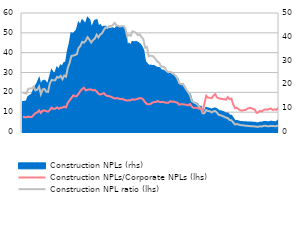
| Category | Construction NPL ratio (lhs) | Construction NPLs/Corporate NPLs (lhs) |
|---|---|---|
|  | 19.909 | 7.77 |
|  | 19.587 | 7.459 |
|  | 19.384 | 7.403 |
|  | 21.841 | 7.803 |
| 6
2010 | 21.9 | 7.569 |
|  | 21.893 | 7.585 |
|  | 22.897 | 8.602 |
|  | 20.957 | 9.578 |
|  | 21.316 | 9.883 |
|  | 22.951 | 10.902 |
| 12 | 19.044 | 9.605 |
| 1
2011 | 21.464 | 10.773 |
|  | 21.647 | 10.817 |
|  | 20.33 | 10.537 |
|  | 20.222 | 10.213 |
|  | 24.486 | 11.167 |
| 6
2011 | 26.307 | 12.286 |
|  | 26.025 | 11.63 |
|  | 26.069 | 11.734 |
|  | 27.804 | 12.439 |
|  | 27.388 | 11.715 |
|  | 28.322 | 12.235 |
| 12 | 26.666 | 12.303 |
| 1
2012 | 28.495 | 12.822 |
|  | 27.903 | 12.414 |
|  | 32.444 | 14.729 |
|  | 34.841 | 15.967 |
|  | 38.393 | 17.166 |
| 6
2012 | 38.504 | 18.425 |
|  | 38.824 | 18.02 |
|  | 39.218 | 18.083 |
|  | 42.401 | 19.329 |
|  | 43.421 | 20.716 |
|  | 45.464 | 21.691 |
| 12 | 45.077 | 22.315 |
| 1
2013 | 46.093 | 20.946 |
|  | 47.827 | 21.339 |
|  | 46.562 | 21.484 |
|  | 45.129 | 21.378 |
|  | 46.309 | 20.985 |
| 6
2013 | 47.078 | 21.124 |
|  | 49.061 | 20.535 |
|  | 47.719 | 19.305 |
|  | 49.11 | 18.858 |
|  | 49.753 | 19.235 |
|  | 51.351 | 19.613 |
| 12 | 52.672 | 18.623 |
| 1
2014 | 52.459 | 18.13 |
|  | 53.449 | 18.092 |
|  | 53.4 | 17.773 |
|  | 53.814 | 17.325 |
|  | 55.031 | 16.909 |
| 6
2014 | 53.856 | 17.062 |
|  | 53.532 | 17.007 |
|  | 53.153 | 16.589 |
|  | 53.392 | 16.713 |
|  | 53.438 | 16.409 |
|  | 52.2 | 16.064 |
| 12 | 48.26 | 15.867 |
| 1
2015 | 48.994 | 15.97 |
|  | 48.54 | 16.023 |
|  | 50.819 | 16.5 |
|  | 50.398 | 16.224 |
|  | 50.034 | 16.529 |
| 6
2015 | 48.852 | 16.755 |
|  | 49.2 | 17.08 |
|  | 47.851 | 17.074 |
|  | 46.8 | 16.302 |
|  | 42.497 | 15.02 |
|  | 42.897 | 14.115 |
| 12 | 38.217 | 14.005 |
| 1
2016 | 38.481 | 14.086 |
|  | 38.357 | 14.828 |
|  | 37.683 | 15.073 |
|  | 36.469 | 15.098 |
|  | 35.485 | 15.671 |
| 6
2016 | 34.686 | 15.189 |
|  | 32.812 | 15.006 |
|  | 33.031 | 15.257 |
|  | 32.472 | 14.824 |
|  | 30.854 | 14.772 |
|  | 30.237 | 14.756 |
| 12 | 30.25 | 15.536 |
| 1
2017 | 30.017 | 15.275 |
|  | 29.166 | 15.356 |
|  | 28.279 | 14.979 |
|  | 26.947 | 14.796 |
|  | 24.631 | 13.709 |
| 6
2017 | 24.106 | 14.046 |
|  | 24.082 | 14.052 |
|  | 22.783 | 13.837 |
|  | 21.226 | 13.72 |
|  | 19.97 | 13.447 |
|  | 18.452 | 14.114 |
| 12 | 15.625 | 12.822 |
| 1
2018 | 14.94 | 12.128 |
|  | 14.54 | 12.227 |
|  | 13.92 | 12.239 |
|  | 12.85 | 11.727 |
|  | 11.9 | 11.834 |
| 6
2018 | 9.5 | 10.392 |
|  | 9.47 | 14.361 |
|  | 11.06 | 18.232 |
|  | 10.59 | 17.345 |
|  | 10.44 | 17.269 |
|  | 9.88 | 17.028 |
| 12 | 10.41 | 18.313 |
| 1
2019 | 10.579 | 19.133 |
|  | 9.755 | 17.365 |
|  | 8.609 | 16.93 |
|  | 8.463 | 16.813 |
|  | 8.06 | 16.583 |
| 6
2019 | 7.693 | 16.56 |
|  | 7.264 | 16.26 |
|  | 7.001 | 17.614 |
|  | 6.068 | 16.511 |
|  | 5.909 | 16.838 |
|  | 4.879 | 13.922 |
| 12 | 3.783 | 12.044 |
| 1
2020 | 4.026 | 12.199 |
|  | 3.781 | 11.477 |
|  | 3.49 | 10.947 |
|  | 3.39 | 10.794 |
|  | 3.325 | 11.042 |
| 6
2020 | 3.14 | 11.152 |
|  | 3.091 | 11.832 |
|  | 3.018 | 12.084 |
|  | 2.917 | 12.046 |
|  | 2.859 | 11.635 |
|  | 2.814 | 11.33 |
| 12 | 2.679 | 9.661 |
| 1
2021 | 2.663 | 9.887 |
|  | 2.852 | 10.711 |
|  | 2.812 | 10.289 |
|  | 3.102 | 11.184 |
|  | 3.133 | 11.428 |
| 6
2021 | 2.923 | 11.253 |
|  | 2.91 | 11.558 |
|  | 3.094 | 11.846 |
|  | 3.046 | 11.12 |
|  | 2.951 | 11.442 |
|  | 2.938 | 11.167 |
| 12 | 3.292 | 12.1 |